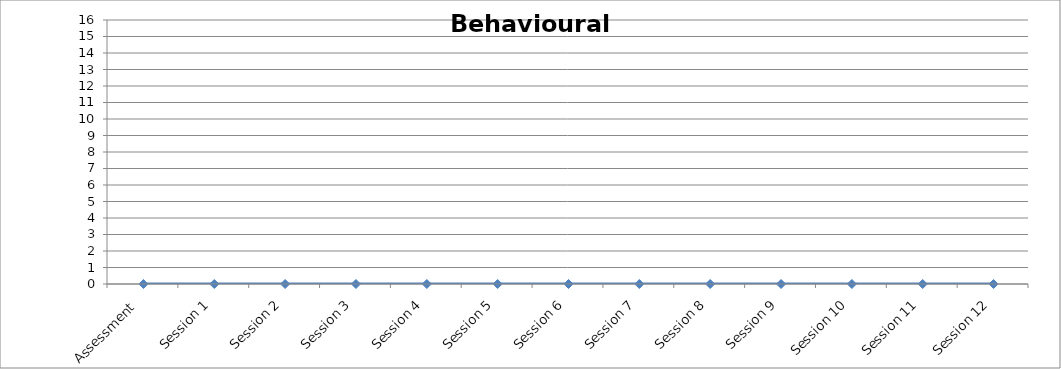
| Category | Series 0 |
|---|---|
| Assessment  | 0 |
| Session 1 | 0 |
| Session 2 | 0 |
| Session 3 | 0 |
| Session 4 | 0 |
| Session 5 | 0 |
| Session 6 | 0 |
| Session 7 | 0 |
| Session 8 | 0 |
| Session 9 | 0 |
| Session 10 | 0 |
| Session 11 | 0 |
| Session 12 | 0 |